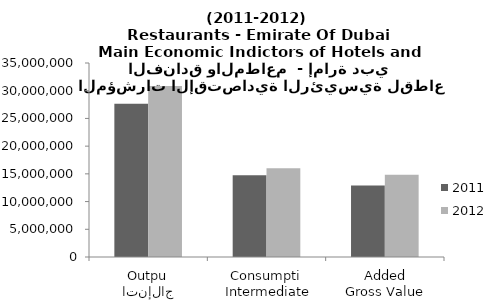
| Category | 2011 | 2012 |
|---|---|---|
|  الإنتاج 
Output | 27658066 | 30828789 |
| الاستهلاك الوسيط 
 Intermediate Consumption | 14748398 | 16009008 |
| القيمة المضافة الإجمالية
Gross Value Added  | 12909669 | 14819781 |